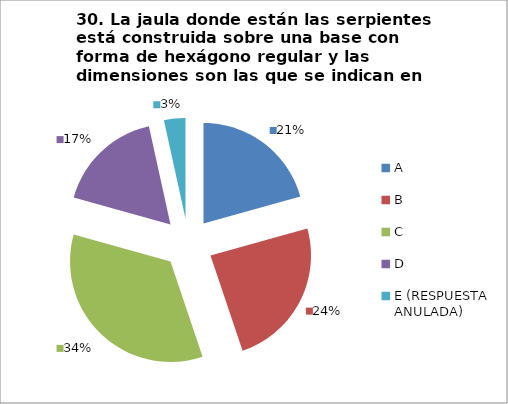
| Category | CANTIDAD DE RESPUESTAS PREGUNTA (30) | PORCENTAJE |
|---|---|---|
| A | 6 | 0.207 |
| B | 7 | 0.241 |
| C | 10 | 0.345 |
| D | 5 | 0.172 |
| E (RESPUESTA ANULADA) | 1 | 0.034 |